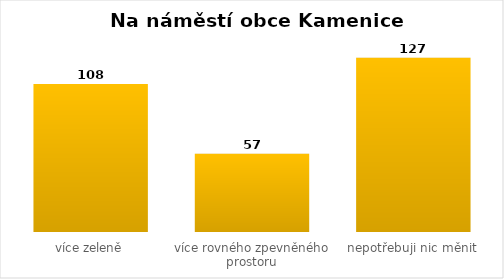
| Category | Series 0 |
|---|---|
| více zeleně | 108 |
| více rovného zpevněného prostoru | 57 |
| nepotřebuji nic měnit | 127 |